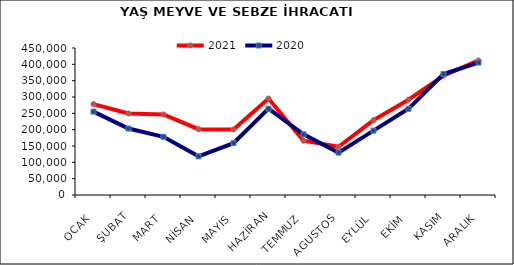
| Category | 2021 | 2020 |
|---|---|---|
| OCAK | 278127.632 | 255282.107 |
| ŞUBAT | 249528.273 | 203425.859 |
| MART | 246515.34 | 178131.422 |
| NİSAN | 201459.413 | 118357.133 |
| MAYIS | 200725.907 | 158686.866 |
| HAZİRAN | 295167.195 | 264193.628 |
| TEMMUZ | 166078.858 | 185540.816 |
| AGUSTOS | 147760.259 | 129732.238 |
| EYLÜL | 229154.954 | 197103.729 |
| EKİM | 291742.467 | 263887.011 |
| KASIM | 365384.755 | 370411.22 |
| ARALIK | 411940.142 | 405234.372 |